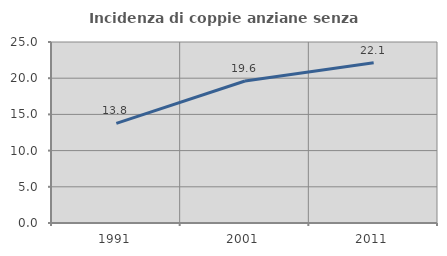
| Category | Incidenza di coppie anziane senza figli  |
|---|---|
| 1991.0 | 13.77 |
| 2001.0 | 19.608 |
| 2011.0 | 22.148 |